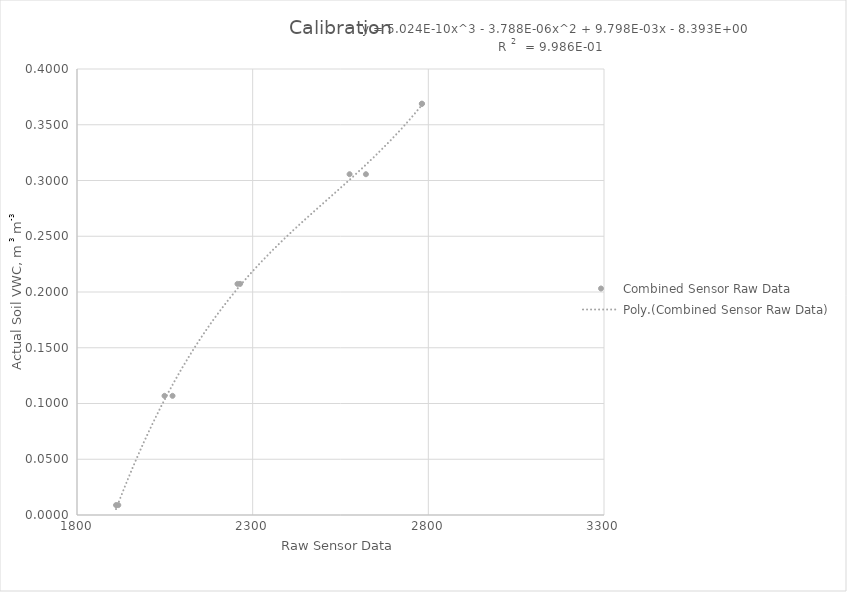
| Category | Combined Sensor Raw Data |
|---|---|
| 1917.5 | 0.009 |
| 2071.9 | 0.107 |
| 2264.2 | 0.207 |
| 2575.8 | 0.306 |
| 2781.9 | 0.369 |
| 1911.1 | 0.009 |
| 2049.1 | 0.107 |
| 2256.8 | 0.207 |
| 2622.4 | 0.306 |
| 2781.5 | 0.369 |